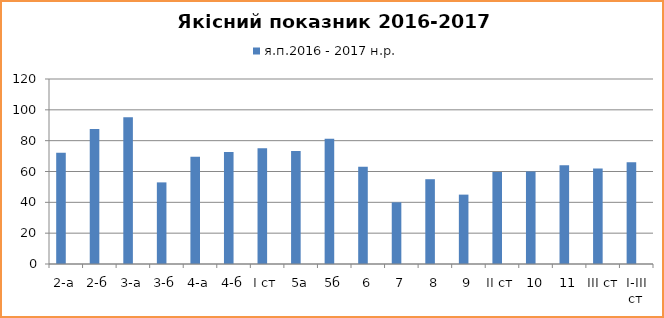
| Category | я.п.2016 - 2017 н.р. |
|---|---|
| 2-а |  |
| 2-б |  |
| 3-а |  |
| 3-б |  |
| 4-а |  |
| 4-б |  |
| І ст |  |
| 5а |  |
| 5б |  |
| 6 |  |
| 7 |  |
| 8 |  |
| 9 |  |
| ІІ ст |  |
| 10 |  |
| 11 |  |
| ІІІ ст |  |
| І-ІІІ ст |  |